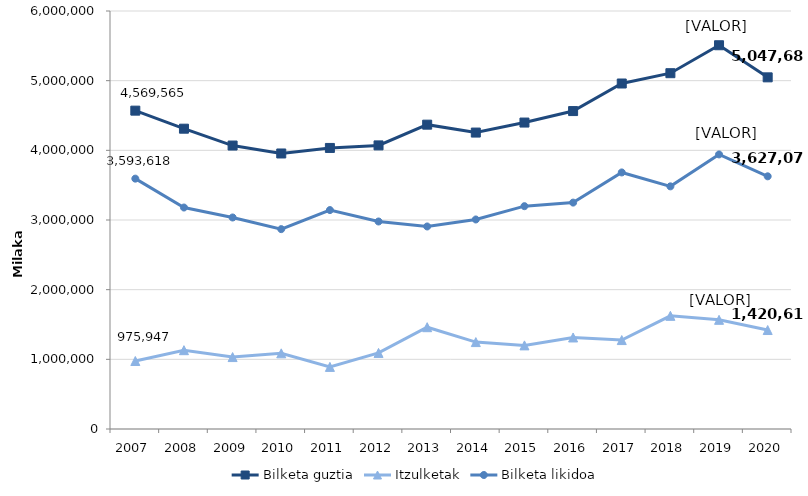
| Category | Bilketa guztia | Itzulketak | Bilketa likidoa |
|---|---|---|---|
| 2007.0 | 4569564.694 | 975947.184 | 3593617.511 |
| 2008.0 | 4310607.817 | 1131418.411 | 3179189.405 |
| 2009.0 | 4068712.882 | 1032557.036 | 3036155.845 |
| 2010.0 | 3954897.595 | 1085991.918 | 2868905.677 |
| 2011.0 | 4034191.014 | 891687.288 | 3142503.727 |
| 2012.0 | 4070844.381 | 1092254.555 | 2978589.826 |
| 2013.0 | 4368385.495 | 1461255.497 | 2907129.998 |
| 2014.0 | 4255033.664 | 1247467.968 | 3007565.696 |
| 2015.0 | 4398741.824 | 1200312.032 | 3198429.792 |
| 2016.0 | 4563540.838 | 1313808.981 | 3249731.857 |
| 2017.0 | 4959181.282 | 1276510.17 | 3682671.113 |
| 2018.0 | 5107259.058 | 1624305.468 | 3482953.59 |
| 2019.0 | 5508404.99 | 1567272.995 | 3941131.995 |
| 2020.0 | 5047688.497 | 1420609.894 | 3627078.603 |